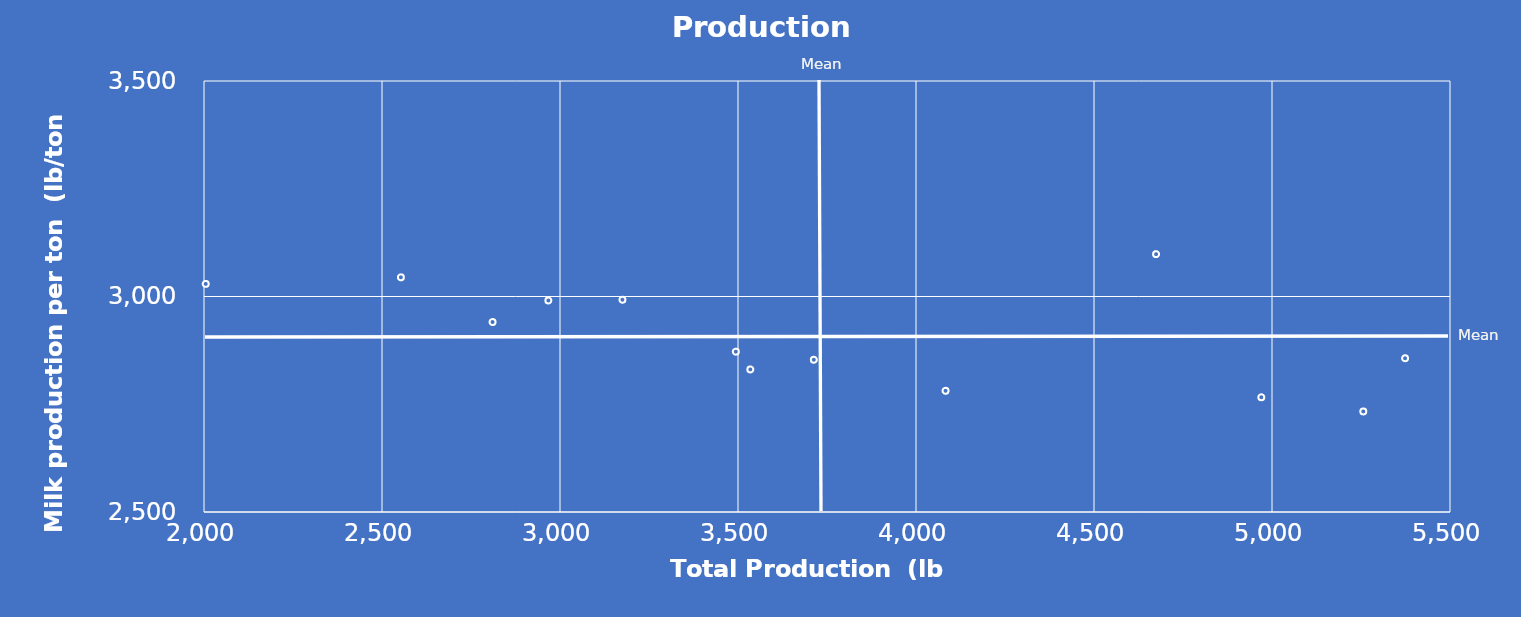
| Category | Series 0 |
|---|---|
| 4082.967035767 | 2781.25 |
| 4969.976027969 | 2766.25 |
| 2810.516796372 | 2940.75 |
| 2967.252067334 | 2990.75 |
| 5373.726187565 | 2856.75 |
| 4674.388548947 | 3098.25 |
| 3493.850188736 | 2872 |
| 3713.0 | 2853.25 |
| 3175.346688292 | 2992.5 |
| 3534.669149008 | 2830.75 |
| 2553.014351901 | 3044.5 |
| 2004.826092422 | 3029.25 |
| 5256.435284911 | 2733.25 |